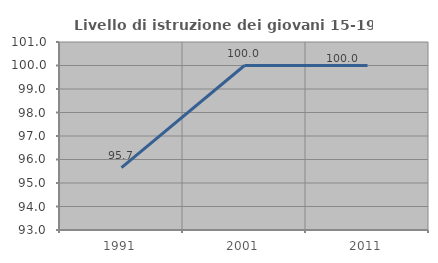
| Category | Livello di istruzione dei giovani 15-19 anni |
|---|---|
| 1991.0 | 95.652 |
| 2001.0 | 100 |
| 2011.0 | 100 |